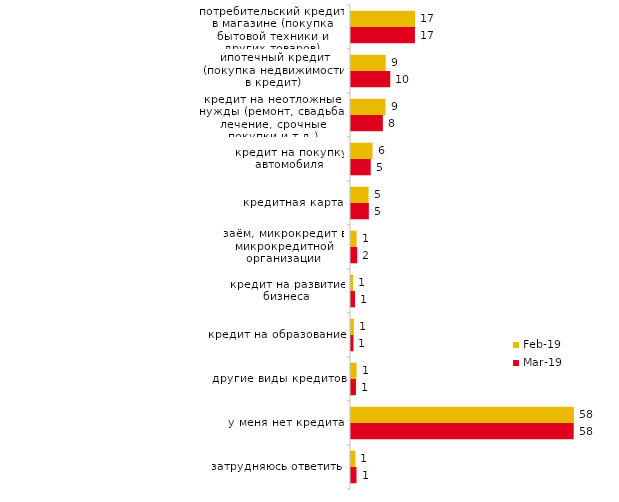
| Category | фев.19 | мар.19 |
|---|---|---|
| потребительский кредит в магазине (покупка бытовой техники и других товаров) | 16.8 | 16.758 |
| ипотечный кредит (покупка недвижимости в кредит) | 9.1 | 10.293 |
| кредит на неотложные нужды (ремонт, свадьба, лечение, срочные покупки и т.д.) | 9.05 | 8.354 |
| кредит на покупку автомобиля | 5.65 | 5.172 |
| кредитная карта | 4.6 | 4.674 |
| заём, микрокредит в микрокредитной организации | 1.45 | 1.641 |
| кредит на развитие бизнеса | 0.55 | 1.044 |
| кредит на образование | 0.75 | 0.646 |
| другие виды кредитов | 1.45 | 1.293 |
| у меня нет кредита | 58.45 | 58.379 |
| затрудняюсь ответить | 1.15 | 1.442 |